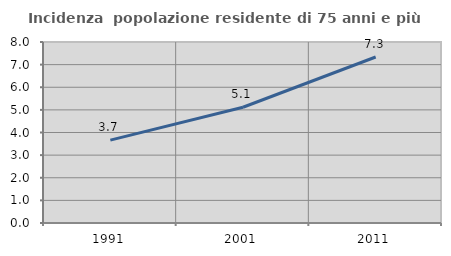
| Category | Incidenza  popolazione residente di 75 anni e più |
|---|---|
| 1991.0 | 3.661 |
| 2001.0 | 5.116 |
| 2011.0 | 7.336 |